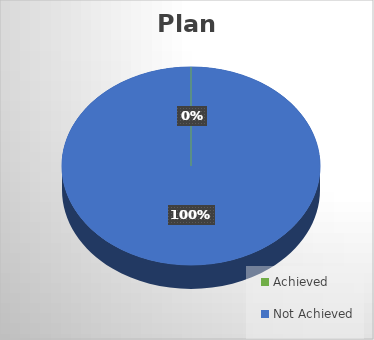
| Category | Goal Achievement | Goals Achieved (%) | Milestones |
|---|---|---|---|
| Achieved | 0 | 0 | 0 |
| Not Achieved | 1 | 0 | 0 |